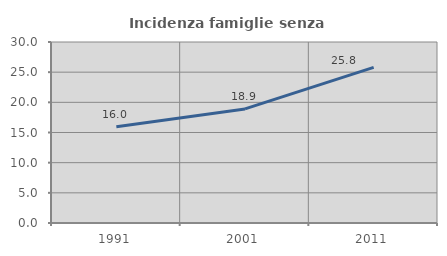
| Category | Incidenza famiglie senza nuclei |
|---|---|
| 1991.0 | 15.961 |
| 2001.0 | 18.911 |
| 2011.0 | 25.795 |